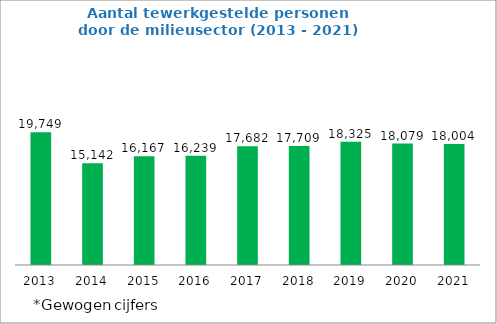
| Category | Aantal tewerkgestelde personen |
|---|---|
| 2013.0 | 19749 |
| 2014.0 | 15142.36 |
| 2015.0 | 16167 |
| 2016.0 | 16239 |
| 2017.0 | 17681.87 |
| 2018.0 | 17709 |
| 2019.0 | 18325 |
| 2020.0 | 18079 |
| 2021.0 | 18004 |